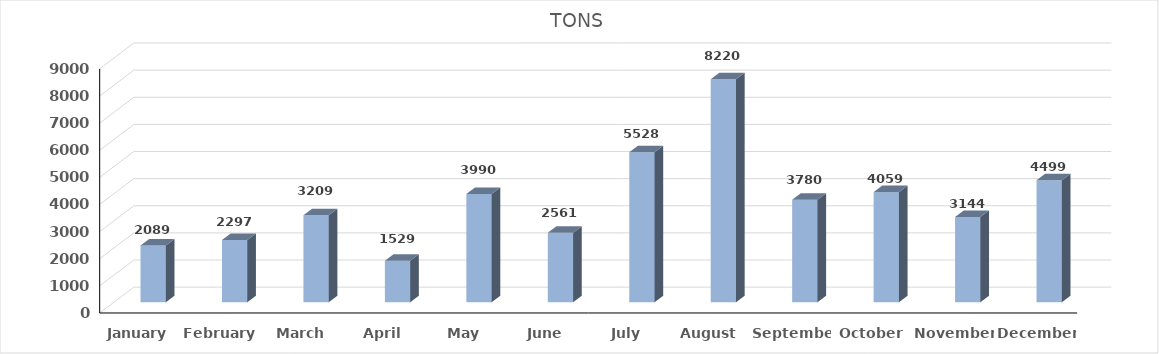
| Category | TONS |
|---|---|
| January | 2089 |
| February | 2297 |
| March | 3209 |
| April | 1529 |
| May | 3990 |
| June | 2561 |
| July | 5528 |
| August | 8220 |
| September | 3780 |
| October | 4059 |
| November | 3144 |
| December | 4499 |